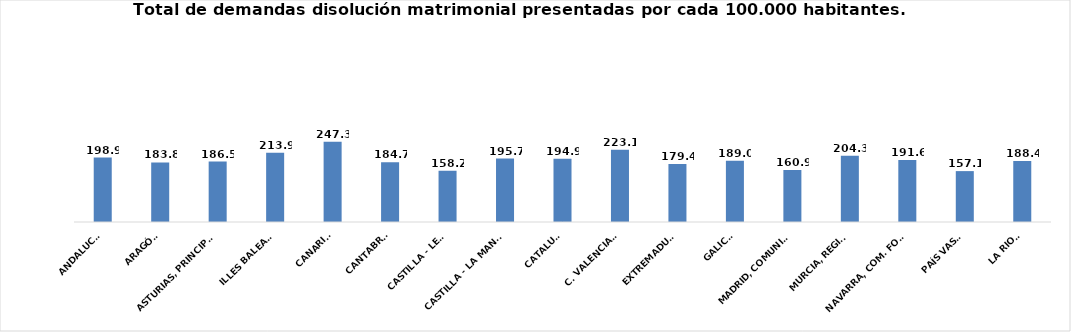
| Category | 198,9 |
|---|---|
| ANDALUCÍA | 198.945 |
| ARAGÓN | 183.795 |
| ASTURIAS, PRINCIPADO | 186.468 |
| ILLES BALEARS | 213.885 |
| CANARIAS | 247.322 |
| CANTABRIA | 184.698 |
| CASTILLA - LEÓN | 158.191 |
| CASTILLA - LA MANCHA | 195.71 |
| CATALUÑA | 194.935 |
| C. VALENCIANA | 223.12 |
| EXTREMADURA | 179.36 |
| GALICIA | 189.02 |
| MADRID, COMUNIDAD | 160.871 |
| MURCIA, REGIÓN | 204.291 |
| NAVARRA, COM. FORAL | 191.61 |
| PAÍS VASCO | 157.079 |
| LA RIOJA | 188.355 |